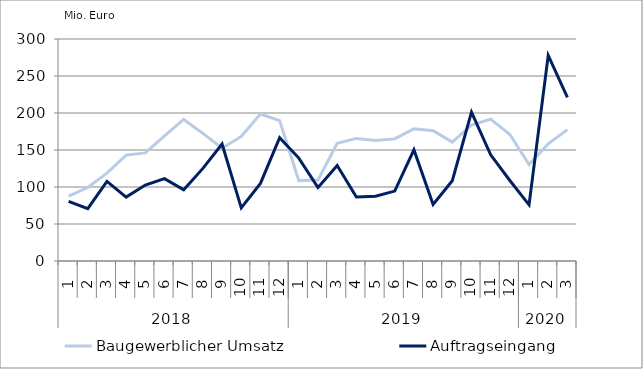
| Category | Baugewerblicher Umsatz | Auftragseingang |
|---|---|---|
| 0 | 87640.529 | 80684.627 |
| 1 | 99259.455 | 70746.763 |
| 2 | 118764.324 | 107538.747 |
| 3 | 143144.178 | 86374.619 |
| 4 | 146070.782 | 102661.329 |
| 5 | 169150.753 | 111287.709 |
| 6 | 191277.885 | 96286.662 |
| 7 | 172425.535 | 125142.495 |
| 8 | 152354.98 | 158112.302 |
| 9 | 168372.756 | 71808.619 |
| 10 | 198558.472 | 104904.147 |
| 11 | 189665.914 | 166653.461 |
| 12 | 108616.605 | 139065.287 |
| 13 | 109331.58 | 99318.609 |
| 14 | 159117.81 | 129002.041 |
| 15 | 165654.287 | 86579.2 |
| 16 | 162976.056 | 87644.362 |
| 17 | 165026.188 | 94463.186 |
| 18 | 178622.938 | 150345.08 |
| 19 | 176074.101 | 76434.317 |
| 20 | 160663.041 | 108444.162 |
| 21 | 183589.485 | 201122.697 |
| 22 | 191777.213 | 143514.792 |
| 23 | 170885.223 | 108780.022 |
| 24 | 130445.562 | 75891.481 |
| 25 | 158433.655 | 277923.85 |
| 26 | 177529.832 | 220973.626 |